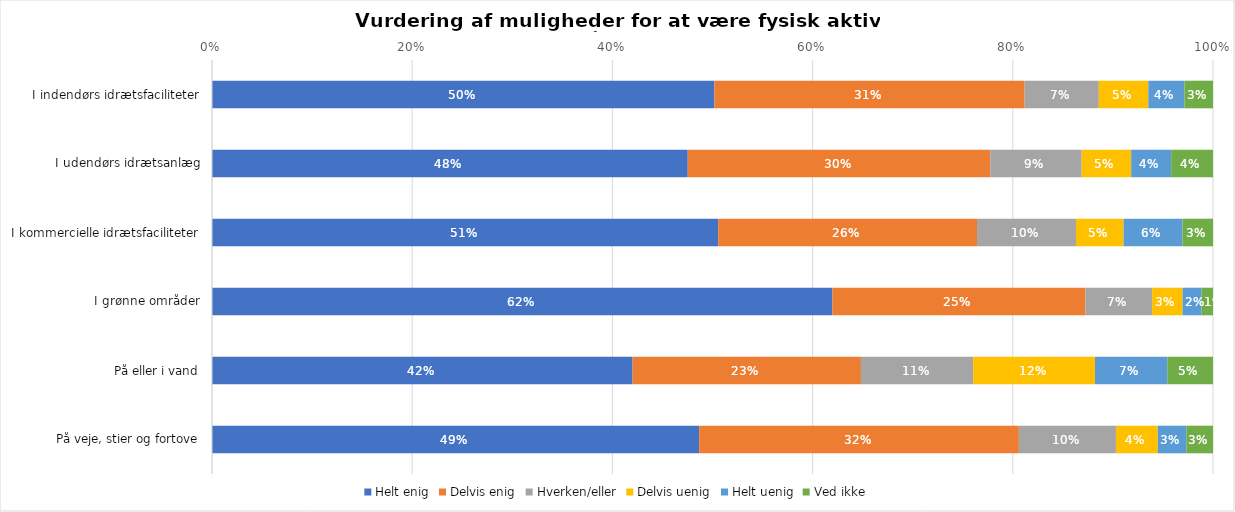
| Category | Helt enig | Delvis enig | Hverken/eller | Delvis uenig | Helt uenig | Ved ikke |
|---|---|---|---|---|---|---|
| I indendørs idrætsfaciliteter | 0.502 | 0.31 | 0.074 | 0.049 | 0.036 | 0.029 |
| I udendørs idrætsanlæg | 0.475 | 0.302 | 0.091 | 0.049 | 0.04 | 0.042 |
| I kommercielle idrætsfaciliteter | 0.506 | 0.259 | 0.099 | 0.048 | 0.059 | 0.03 |
| I grønne områder | 0.62 | 0.253 | 0.067 | 0.03 | 0.019 | 0.011 |
| På eller i vand | 0.42 | 0.228 | 0.112 | 0.122 | 0.072 | 0.046 |
| På veje, stier og fortove | 0.487 | 0.319 | 0.097 | 0.042 | 0.029 | 0.027 |